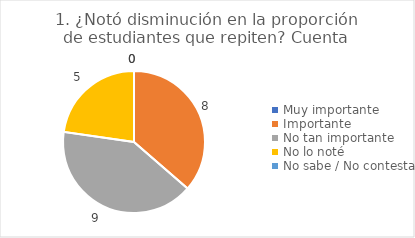
| Category | 1. ¿Notó disminución en la proporción de estudiantes que repiten? |
|---|---|
| Muy importante  | 0 |
| Importante  | 0.364 |
| No tan importante  | 0.409 |
| No lo noté  | 0.227 |
| No sabe / No contesta | 0 |